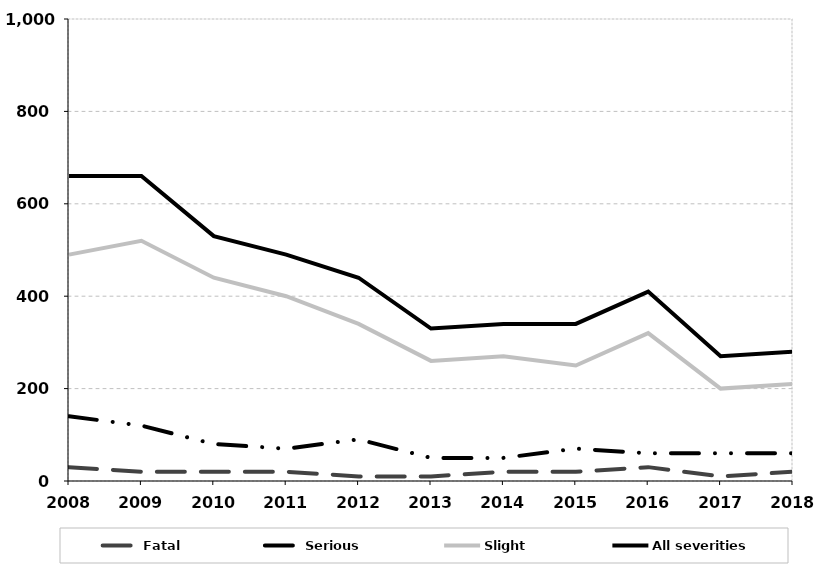
| Category | Fatal | Serious | Slight | All severities |
|---|---|---|---|---|
| 2008.0 | 30 | 140 | 490 | 660 |
| 2009.0 | 20 | 120 | 520 | 660 |
| 2010.0 | 20 | 80 | 440 | 530 |
| 2011.0 | 20 | 70 | 400 | 490 |
| 2012.0 | 10 | 90 | 340 | 440 |
| 2013.0 | 10 | 50 | 260 | 330 |
| 2014.0 | 20 | 50 | 270 | 340 |
| 2015.0 | 20 | 70 | 250 | 340 |
| 2016.0 | 30 | 60 | 320 | 410 |
| 2017.0 | 10 | 60 | 200 | 270 |
| 2018.0 | 20 | 60 | 210 | 280 |